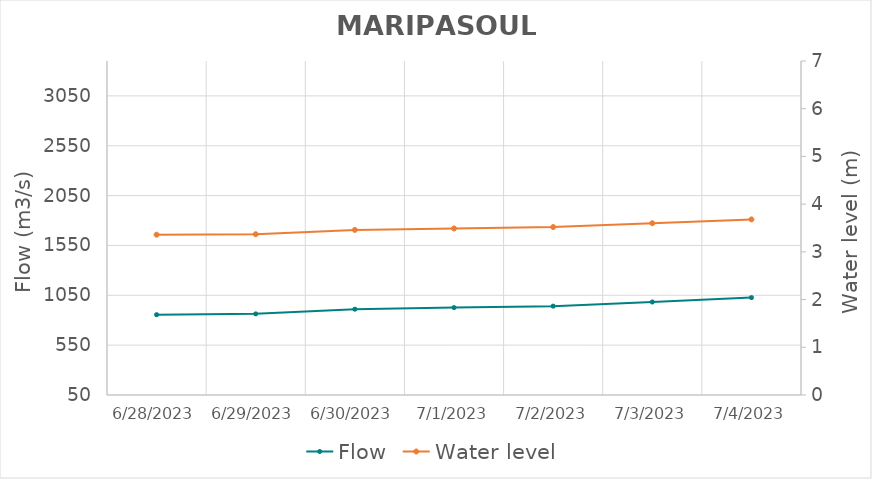
| Category | Flow |
|---|---|
| 4/26/22 | 2674.62 |
| 4/25/22 | 2596.45 |
| 4/24/22 | 2479.48 |
| 4/23/22 | 2375.34 |
| 4/22/22 | 2270.87 |
| 4/21/22 | 2161.79 |
| 4/20/22 | 2150.66 |